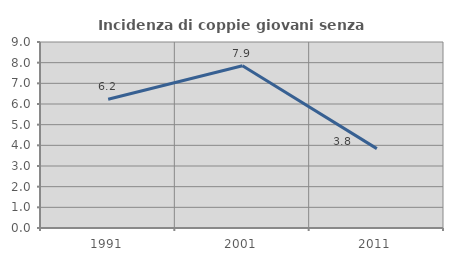
| Category | Incidenza di coppie giovani senza figli |
|---|---|
| 1991.0 | 6.233 |
| 2001.0 | 7.853 |
| 2011.0 | 3.842 |